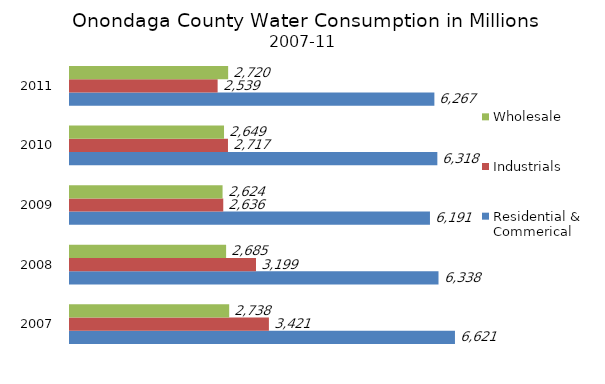
| Category | Residential & Commerical | Industrials | Wholesale |
|---|---|---|---|
| 2007.0 | 6621 | 3421 | 2738 |
| 2008.0 | 6338 | 3199 | 2685 |
| 2009.0 | 6191 | 2636 | 2624 |
| 2010.0 | 6318 | 2717 | 2649 |
| 2011.0 | 6267 | 2539 | 2720 |